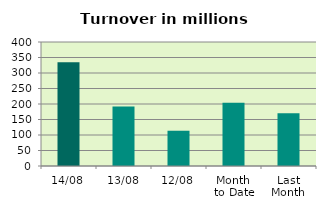
| Category | Series 0 |
|---|---|
| 14/08 | 334.482 |
| 13/08 | 191.543 |
| 12/08 | 113.747 |
| Month 
to Date | 203.942 |
| Last
Month | 170.387 |